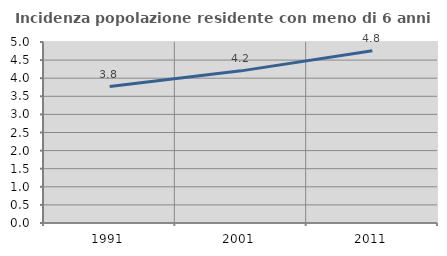
| Category | Incidenza popolazione residente con meno di 6 anni |
|---|---|
| 1991.0 | 3.768 |
| 2001.0 | 4.203 |
| 2011.0 | 4.757 |